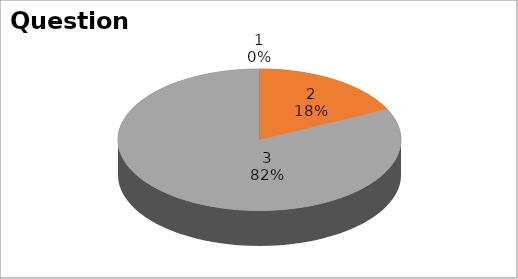
| Category | Series 0 |
|---|---|
| 0 | 0 |
| 1 | 5 |
| 2 | 23 |